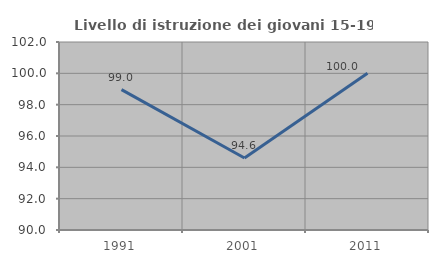
| Category | Livello di istruzione dei giovani 15-19 anni |
|---|---|
| 1991.0 | 98.958 |
| 2001.0 | 94.595 |
| 2011.0 | 100 |